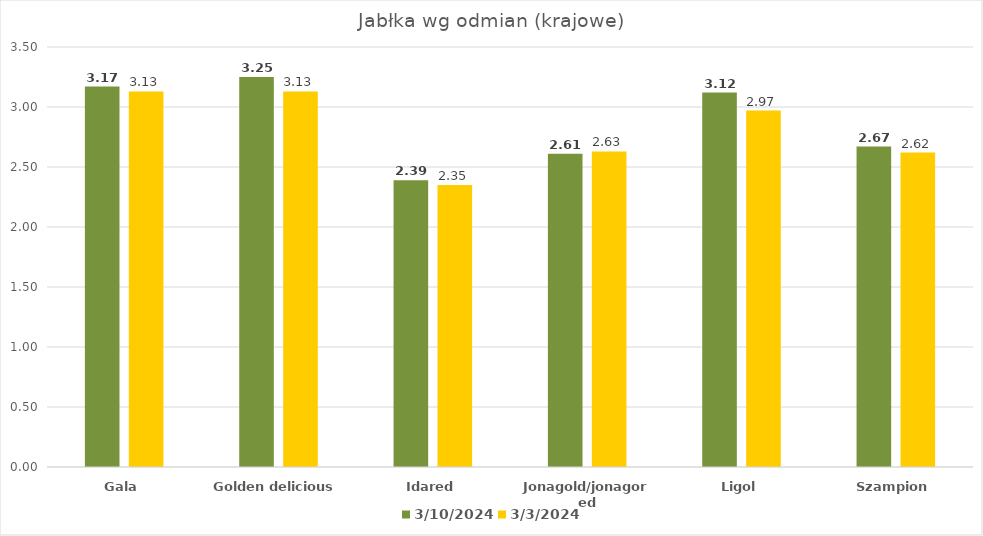
| Category | 2024-03-10 | 2024-03-03 |
|---|---|---|
| Gala | 3.17 | 3.13 |
| Golden delicious | 3.25 | 3.13 |
| Idared | 2.39 | 2.35 |
| Jonagold/jonagored | 2.61 | 2.63 |
| Ligol | 3.12 | 2.97 |
| Szampion | 2.67 | 2.62 |